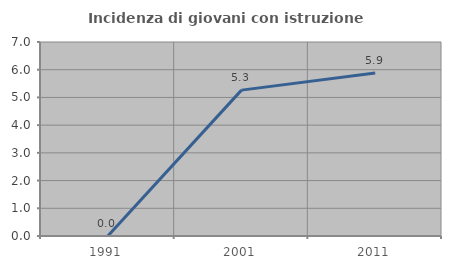
| Category | Incidenza di giovani con istruzione universitaria |
|---|---|
| 1991.0 | 0 |
| 2001.0 | 5.263 |
| 2011.0 | 5.882 |